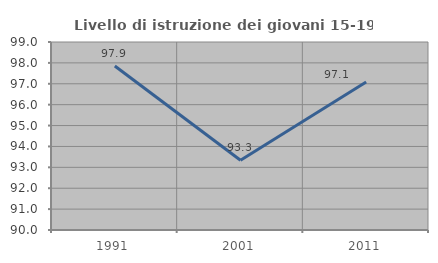
| Category | Livello di istruzione dei giovani 15-19 anni |
|---|---|
| 1991.0 | 97.855 |
| 2001.0 | 93.341 |
| 2011.0 | 97.088 |